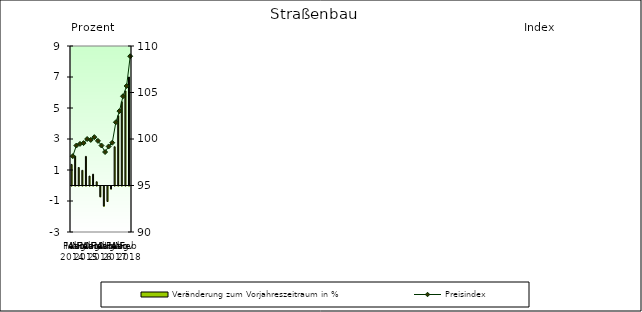
| Category | Veränderung zum Vorjahreszeitraum in % |
|---|---|
| 0 | 1.36 |
| 1 | 1.892 |
| 2 | 1.161 |
| 3 | 0.98 |
| 4 | 1.878 |
| 5 | 0.607 |
| 6 | 0.731 |
| 7 | 0.24 |
| 8 | -0.7 |
| 9 | -1.3 |
| 10 | -1 |
| 11 | -0.2 |
| 12 | 2.5 |
| 13 | 4.5 |
| 14 | 5.4 |
| 15 | 6.1 |
| 16 | 7 |